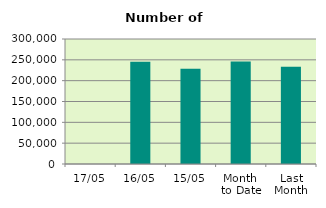
| Category | Series 0 |
|---|---|
| 17/05 | 0 |
| 16/05 | 245532 |
| 15/05 | 228458 |
| Month 
to Date | 245952.364 |
| Last
Month | 233247 |